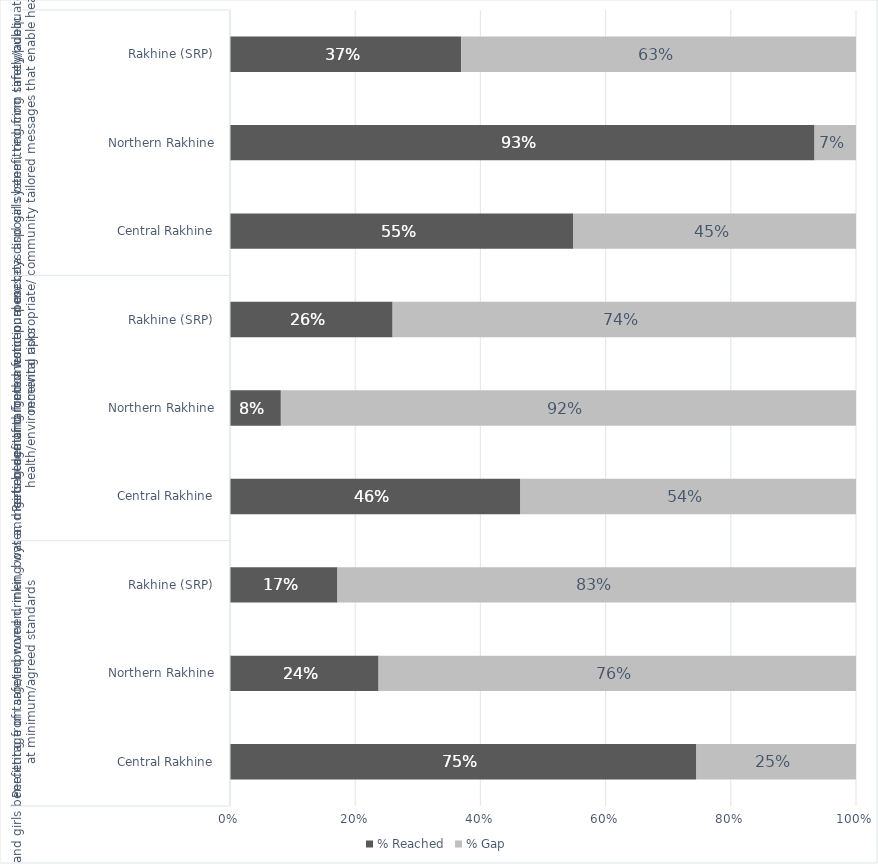
| Category | % Reached | % Gap |
|---|---|---|
| 0 | 0.745 | 0.255 |
| 1 | 0.237 | 0.763 |
| 2 | 0.172 | 0.828 |
| 3 | 0.464 | 0.536 |
| 4 | 0.081 | 0.919 |
| 5 | 0.26 | 0.74 |
| 6 | 0.549 | 0.451 |
| 7 | 0.934 | 0.066 |
| 8 | 0.369 | 0.631 |